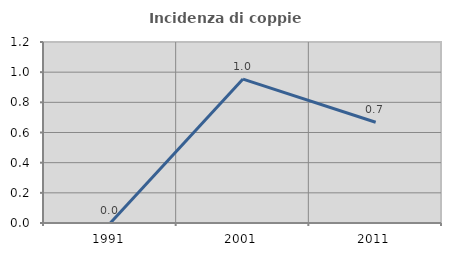
| Category | Incidenza di coppie miste |
|---|---|
| 1991.0 | 0 |
| 2001.0 | 0.954 |
| 2011.0 | 0.668 |